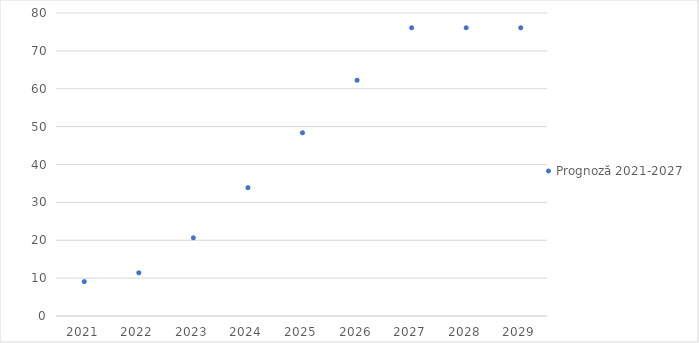
| Category | Prognoză 2021-2027 |
|---|---|
| 2021.0 | 9.089 |
| 2022.0 | 11.4 |
| 2023.0 | 20.642 |
| 2024.0 | 33.891 |
| 2025.0 | 48.371 |
| 2026.0 | 62.235 |
| 2027.0 | 76.1 |
| 2028.0 | 76.1 |
| 2029.0 | 76.1 |